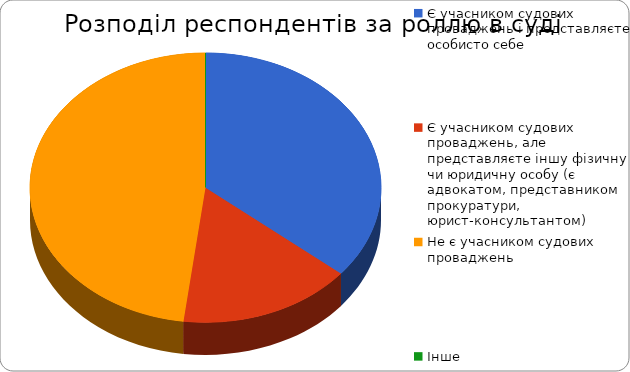
| Category | Series 0 |
|---|---|
| Є учасником судових проваджень і представляєте особисто себе | 18 |
| Є учасником судових проваджень, але представляєте іншу фізичну чи юридичну особу (є адвокатом, представником прокуратури, юрист-консультантом) | 8 |
| Не є учасником судових проваджень | 24 |
| Інше | 0 |